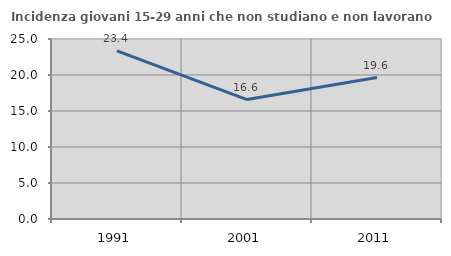
| Category | Incidenza giovani 15-29 anni che non studiano e non lavorano  |
|---|---|
| 1991.0 | 23.355 |
| 2001.0 | 16.583 |
| 2011.0 | 19.649 |